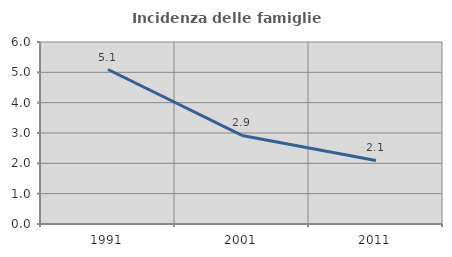
| Category | Incidenza delle famiglie numerose |
|---|---|
| 1991.0 | 5.093 |
| 2001.0 | 2.921 |
| 2011.0 | 2.095 |